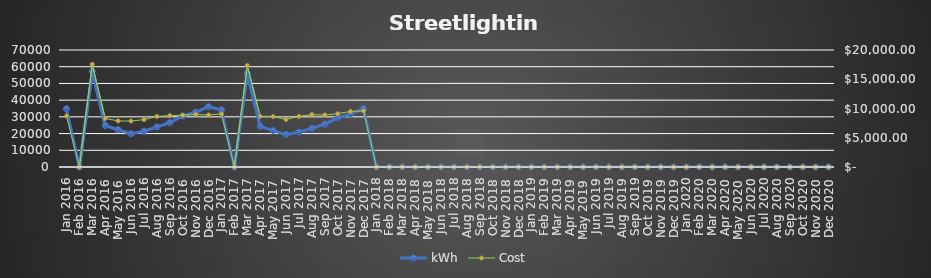
| Category | kWh |
|---|---|
| Jan 2016 | 34838 |
| Feb 2016 | 0 |
| Mar 2016 | 57239 |
| Apr 2016 | 24807 |
| May 2016 | 22305 |
| Jun 2016 | 19879 |
| Jul 2016 | 21407 |
| Aug 2016 | 23902 |
| Sep 2016 | 26563 |
| Oct 2016 | 30559 |
| Nov 2016 | 32745 |
| Dec 2016 | 36078 |
| Jan 2017 | 34175 |
| Feb 2017 | 0 |
| Mar 2017 | 56072 |
| Apr 2017 | 24350 |
| May 2017 | 21787 |
| Jun 2017 | 19378 |
| Jul 2017 | 20899 |
| Aug 2017 | 23102 |
| Sep 2017 | 25640 |
| Oct 2017 | 29428 |
| Nov 2017 | 31644 |
| Dec 2017 | 34944 |
| Jan 2018 | 0 |
| Feb 2018 | 0 |
| Mar 2018 | 0 |
| Apr 2018 | 0 |
| May 2018 | 0 |
| Jun 2018 | 0 |
| Jul 2018 | 0 |
| Aug 2018 | 0 |
| Sep 2018 | 0 |
| Oct 2018 | 0 |
| Nov 2018 | 0 |
| Dec 2018 | 0 |
| Jan 2019 | 0 |
| Feb 2019 | 0 |
| Mar 2019 | 0 |
| Apr 2019 | 0 |
| May 2019 | 0 |
| Jun 2019 | 0 |
| Jul 2019 | 0 |
| Aug 2019 | 0 |
| Sep 2019 | 0 |
| Oct 2019 | 0 |
| Nov 2019 | 0 |
| Dec 2019 | 0 |
| Jan 2020 | 0 |
| Feb 2020 | 0 |
| Mar 2020 | 0 |
| Apr 2020 | 0 |
| May 2020 | 0 |
| Jun 2020 | 0 |
| Jul 2020 | 0 |
| Aug 2020 | 0 |
| Sep 2020 | 0 |
| Oct 2020 | 0 |
| Nov 2020 | 0 |
| Dec 2020 | 0 |